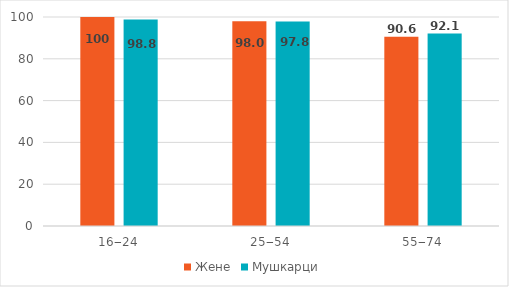
| Category | Жене | Мушкарци |
|---|---|---|
| 16‒24 | 100 | 98.8 |
| 25‒54 | 98 | 97.8 |
| 55‒74 | 90.6 | 92.1 |